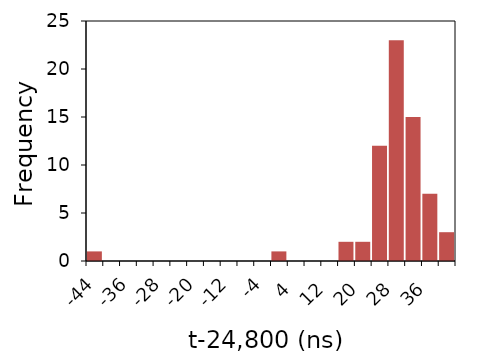
| Category | Series 1 |
|---|---|
| -44.0 | 1 |
| -40.0 | 0 |
| -36.0 | 0 |
| -32.0 | 0 |
| -28.0 | 0 |
| -24.0 | 0 |
| -20.0 | 0 |
| -16.0 | 0 |
| -12.0 | 0 |
| -8.0 | 0 |
| -4.0 | 0 |
| 0.0 | 1 |
| 4.0 | 0 |
| 8.0 | 0 |
| 12.0 | 0 |
| 16.0 | 2 |
| 20.0 | 2 |
| 24.0 | 12 |
| 28.0 | 23 |
| 32.0 | 15 |
| 36.0 | 7 |
| 40.0 | 3 |